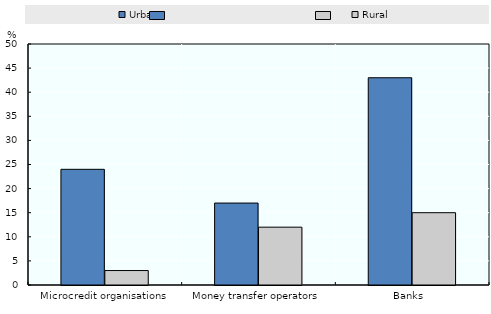
| Category | Urban | Rural |
|---|---|---|
| Microcredit organisations | 24 | 3 |
| Money transfer operators | 17 | 12 |
| Banks  | 43 | 15 |